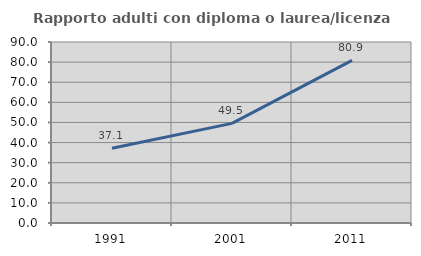
| Category | Rapporto adulti con diploma o laurea/licenza media  |
|---|---|
| 1991.0 | 37.143 |
| 2001.0 | 49.55 |
| 2011.0 | 80.851 |